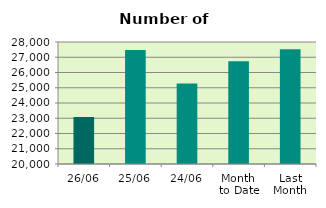
| Category | Series 0 |
|---|---|
| 26/06 | 23090 |
| 25/06 | 27478 |
| 24/06 | 25284 |
| Month 
to Date | 26729.889 |
| Last
Month | 27522.455 |